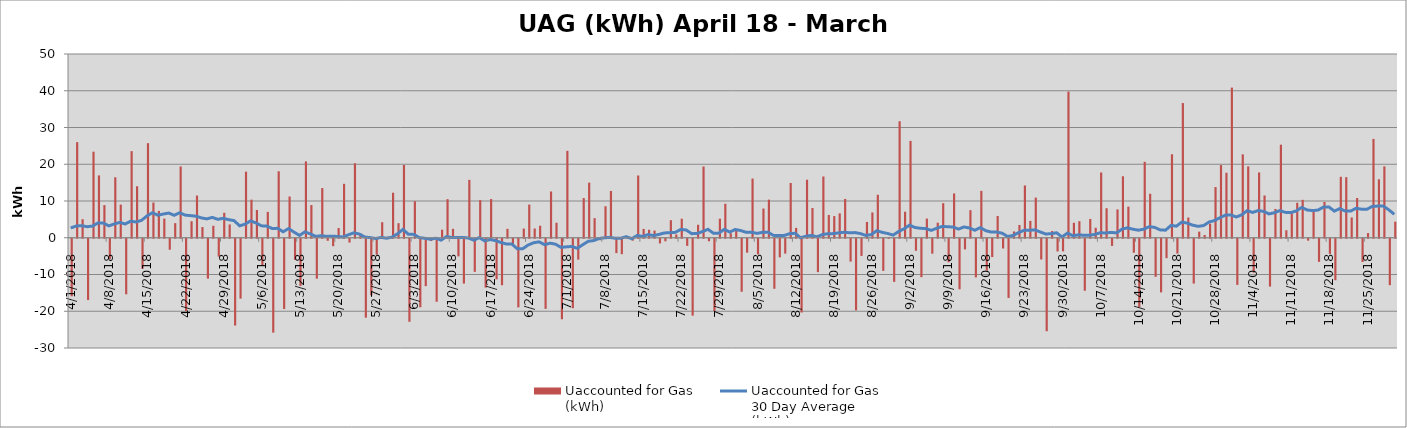
| Category | Uaccounted for Gas 
(kWh) |
|---|---|
| 4/1/18 | -15658125 |
| 4/2/18 | 26015403 |
| 4/3/18 | 5051025 |
| 4/4/18 | -16688992 |
| 4/5/18 | 23421405 |
| 4/6/18 | 16971481 |
| 4/7/18 | 8877600 |
| 4/8/18 | -5487145 |
| 4/9/18 | 16451917 |
| 4/10/18 | 9025739 |
| 4/11/18 | -15117433 |
| 4/12/18 | 23564728 |
| 4/13/18 | 14007820 |
| 4/14/18 | -8170911 |
| 4/15/18 | 25738298 |
| 4/16/18 | 9588799 |
| 4/17/18 | 7309420 |
| 4/18/18 | 5202558 |
| 4/19/18 | -2981597 |
| 4/20/18 | 3982564 |
| 4/21/18 | 19405629 |
| 4/22/18 | -19671075 |
| 4/23/18 | 4497848 |
| 4/24/18 | 11481412 |
| 4/25/18 | 2910766 |
| 4/26/18 | -10844341 |
| 4/27/18 | 3254680 |
| 4/28/18 | -4864854 |
| 4/29/18 | 6794079 |
| 4/30/18 | 3621745 |
| 5/1/18 | -23614366 |
| 5/2/18 | -16292802 |
| 5/3/18 | 17981897 |
| 5/4/18 | 10364219 |
| 5/5/18 | 7554162 |
| 5/6/18 | -7345702 |
| 5/7/18 | 7043708 |
| 5/8/18 | -25547286 |
| 5/9/18 | 18094809 |
| 5/10/18 | -19127397 |
| 5/11/18 | 11223263 |
| 5/12/18 | -5746042 |
| 5/13/18 | -12827655 |
| 5/14/18 | 20774823 |
| 5/15/18 | 8899787 |
| 5/16/18 | -10860723 |
| 5/17/18 | 13518896 |
| 5/18/18 | -554376 |
| 5/19/18 | -2024676 |
| 5/20/18 | 2637353 |
| 5/21/18 | 14671991 |
| 5/22/18 | -1039536 |
| 5/23/18 | 20274431 |
| 5/24/18 | 1151581 |
| 5/25/18 | -21483294 |
| 5/26/18 | -15387521 |
| 5/27/18 | -4319399 |
| 5/28/18 | 4237444 |
| 5/29/18 | 282864 |
| 5/30/18 | 12257861 |
| 5/31/18 | 3962321 |
| 6/1/18 | 19802011 |
| 6/2/18 | -22597953 |
| 6/3/18 | 9947618 |
| 6/4/18 | -18647518 |
| 6/5/18 | -12895102 |
| 6/6/18 | -623278 |
| 6/7/18 | -17148640 |
| 6/8/18 | 2190769 |
| 6/9/18 | 10497982 |
| 6/10/18 | 2428479 |
| 6/11/18 | -4803975 |
| 6/12/18 | -12196700 |
| 6/13/18 | 15744325 |
| 6/14/18 | -9015839 |
| 6/15/18 | 10230907 |
| 6/16/18 | -13299647 |
| 6/17/18 | 10529943 |
| 6/18/18 | -11041294 |
| 6/19/18 | -12643875 |
| 6/20/18 | 2429972 |
| 6/21/18 | -1521838 |
| 6/22/18 | -18676547 |
| 6/23/18 | 2492544 |
| 6/24/18 | 9024949 |
| 6/25/18 | 2510797 |
| 6/26/18 | 3270316 |
| 6/27/18 | -19079133 |
| 6/28/18 | 12596768 |
| 6/29/18 | 4088036 |
| 6/30/18 | -21909346 |
| 7/1/18 | 23651297 |
| 7/2/18 | -18897699 |
| 7/3/18 | -5684340 |
| 7/4/18 | 10793161 |
| 7/5/18 | 14992216 |
| 7/6/18 | 5328674 |
| 7/7/18 | -387772 |
| 7/8/18 | 8571809 |
| 7/9/18 | 12737039 |
| 7/10/18 | -3907844 |
| 7/11/18 | -4193629 |
| 7/12/18 | 11977 |
| 7/13/18 | -509667 |
| 7/14/18 | 16938400 |
| 7/15/18 | 2407925 |
| 7/16/18 | 2176303 |
| 7/17/18 | 1947809 |
| 7/18/18 | -1269270 |
| 7/19/18 | -700348 |
| 7/20/18 | 4784543 |
| 7/21/18 | 909714 |
| 7/22/18 | 5181337 |
| 7/23/18 | -1938823 |
| 7/24/18 | -20930235 |
| 7/25/18 | 3537084 |
| 7/26/18 | 19387113 |
| 7/27/18 | -683119 |
| 7/28/18 | -19699830 |
| 7/29/18 | 5178632 |
| 7/30/18 | 9253570 |
| 7/31/18 | 1204190 |
| 8/1/18 | 2071529 |
| 8/2/18 | -14424980 |
| 8/3/18 | -3788383 |
| 8/4/18 | 16110116 |
| 8/5/18 | -4254295 |
| 8/6/18 | 7950015 |
| 8/7/18 | 10377892 |
| 8/8/18 | -13617791 |
| 8/9/18 | -5070129 |
| 8/10/18 | -4041653 |
| 8/11/18 | 14898316 |
| 8/12/18 | 2684458 |
| 8/13/18 | -20071923 |
| 8/14/18 | 15791240 |
| 8/15/18 | 8093404 |
| 8/16/18 | -9086258 |
| 8/17/18 | 16667947 |
| 8/18/18 | 6201336 |
| 8/19/18 | 5900633 |
| 8/20/18 | 6647370 |
| 8/21/18 | 10556113 |
| 8/22/18 | -6217733 |
| 8/23/18 | -19486109 |
| 8/24/18 | -4672964 |
| 8/25/18 | 4304958 |
| 8/26/18 | 6882725 |
| 8/27/18 | 11694792 |
| 8/28/18 | -8745572 |
| 8/29/18 | 97484 |
| 8/30/18 | -11741351 |
| 8/31/18 | 31707278 |
| 9/1/18 | 7081505 |
| 9/2/18 | 26357046 |
| 9/3/18 | -3280487 |
| 9/4/18 | -10444309 |
| 9/5/18 | 5214065 |
| 9/6/18 | -4058832 |
| 9/7/18 | 4100091 |
| 9/8/18 | 9411837 |
| 9/9/18 | -6398435 |
| 9/10/18 | 12055888 |
| 9/11/18 | -13735059 |
| 9/12/18 | -2892620 |
| 9/13/18 | 7510791 |
| 9/14/18 | -10501346 |
| 9/15/18 | 12753518 |
| 9/16/18 | -8679732 |
| 9/17/18 | -4985240 |
| 9/18/18 | 5930516 |
| 9/19/18 | -2649942 |
| 9/20/18 | -16110488 |
| 9/21/18 | 1718111 |
| 9/22/18 | 3481917 |
| 9/23/18 | 14229011 |
| 9/24/18 | 4596930 |
| 9/25/18 | 10926057 |
| 9/26/18 | -5646864 |
| 9/27/18 | -25159984 |
| 9/28/18 | 1822076 |
| 9/29/18 | -3458565 |
| 9/30/18 | -3434220 |
| 10/1/18 | 39782640 |
| 10/2/18 | 4072595 |
| 10/3/18 | 4506771 |
| 10/4/18 | -14157373 |
| 10/5/18 | 5115037 |
| 10/6/18 | 2725924 |
| 10/7/18 | 17764863 |
| 10/8/18 | 8033320 |
| 10/9/18 | -1950123 |
| 10/10/18 | 7714816 |
| 10/11/18 | 16729824 |
| 10/12/18 | 8466193 |
| 10/13/18 | -3805235 |
| 10/14/18 | -18662057 |
| 10/15/18 | 20659393 |
| 10/16/18 | 11973842 |
| 10/17/18 | -10361714 |
| 10/18/18 | -14598962 |
| 10/19/18 | -5282757 |
| 10/20/18 | 22715968 |
| 10/21/18 | -4040582 |
| 10/22/18 | 36652189 |
| 10/23/18 | 5497041 |
| 10/24/18 | -12191072 |
| 10/25/18 | 1659320 |
| 10/26/18 | 762856 |
| 10/27/18 | 3825791 |
| 10/28/18 | 13788744 |
| 10/29/18 | 19779590 |
| 10/30/18 | 17692175 |
| 10/31/18 | 40858013 |
| 11/1/18 | -12554814 |
| 11/2/18 | 22704342 |
| 11/3/18 | 19427811 |
| 11/4/18 | -9219883 |
| 11/5/18 | 17769728 |
| 11/6/18 | 11505478 |
| 11/7/18 | -13015027 |
| 11/8/18 | 7848633 |
| 11/9/18 | 25322883 |
| 11/10/18 | 2045872 |
| 11/11/18 | 6627537 |
| 11/12/18 | 9522079 |
| 11/13/18 | 10317053 |
| 11/14/18 | -517553 |
| 11/15/18 | 7309442 |
| 11/16/18 | -6298864 |
| 11/17/18 | 9737382 |
| 11/18/18 | -4120197 |
| 11/19/18 | -11295331 |
| 11/20/18 | 16589944 |
| 11/21/18 | 16483718 |
| 11/22/18 | 5529830 |
| 11/23/18 | 10815523 |
| 11/24/18 | -6319432 |
| 11/25/18 | 1272113 |
| 11/26/18 | 26891026 |
| 11/27/18 | 15899175 |
| 11/28/18 | 19419355 |
| 11/29/18 | -12636902 |
| 11/30/18 | 4386900 |